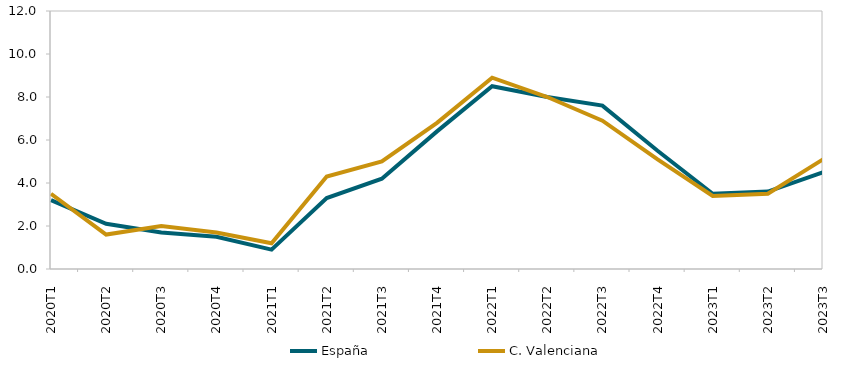
| Category | España | C. Valenciana |
|---|---|---|
| 2020T1 | 3.2 | 3.5 |
| 2020T2 | 2.1 | 1.6 |
| 2020T3 | 1.7 | 2 |
| 2020T4 | 1.5 | 1.7 |
| 2021T1 | 0.9 | 1.2 |
| 2021T2 | 3.3 | 4.3 |
| 2021T3 | 4.2 | 5 |
| 2021T4 | 6.4 | 6.8 |
| 2022T1 | 8.5 | 8.9 |
| 2022T2 | 8 | 8 |
| 2022T3 | 7.6 | 6.9 |
| 2022T4 | 5.5 | 5.1 |
| 2023T1 | 3.5 | 3.4 |
| 2023T2 | 3.6 | 3.5 |
| 2023T3 | 4.5 | 5.1 |